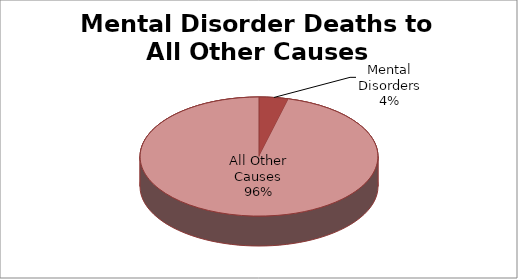
| Category | Series 0 |
|---|---|
| Mental Disorders | 1 |
| All Other Causes | 24 |